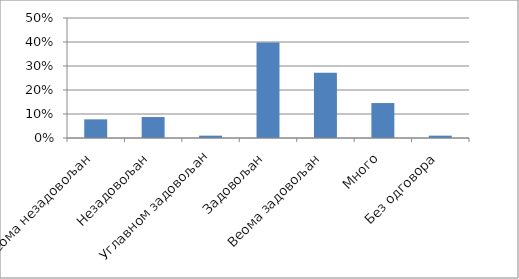
| Category | Series 0 |
|---|---|
| Веома незадовољан | 0.078 |
| Незадовољан | 0.087 |
| Углавном задовољан | 0.01 |
| Задовољан | 0.398 |
| Веома задовољан | 0.272 |
| Много | 0.146 |
| Без одговора | 0.01 |